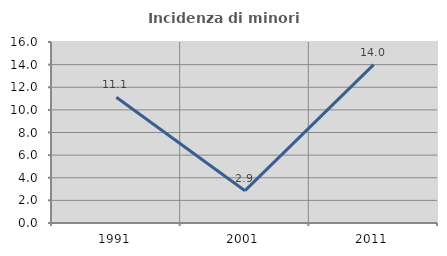
| Category | Incidenza di minori stranieri |
|---|---|
| 1991.0 | 11.111 |
| 2001.0 | 2.857 |
| 2011.0 | 14 |